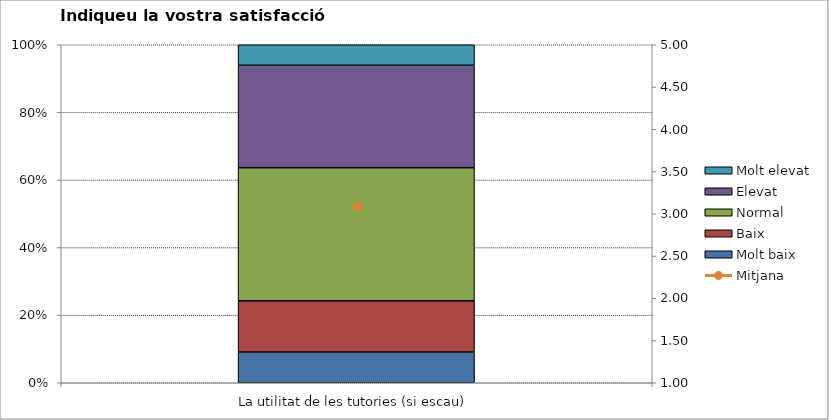
| Category | Molt baix | Baix | Normal  | Elevat | Molt elevat |
|---|---|---|---|---|---|
| La utilitat de les tutories (si escau) | 3 | 5 | 13 | 10 | 2 |